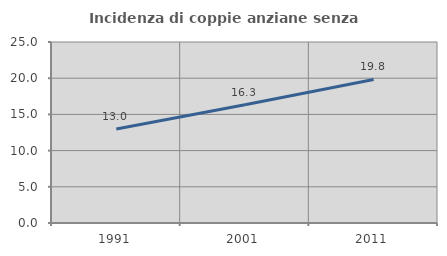
| Category | Incidenza di coppie anziane senza figli  |
|---|---|
| 1991.0 | 12.984 |
| 2001.0 | 16.336 |
| 2011.0 | 19.824 |